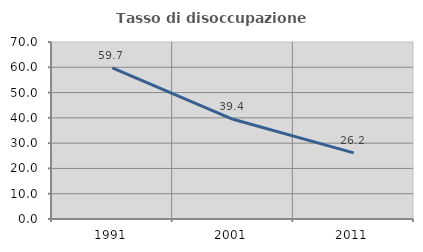
| Category | Tasso di disoccupazione giovanile  |
|---|---|
| 1991.0 | 59.732 |
| 2001.0 | 39.437 |
| 2011.0 | 26.154 |